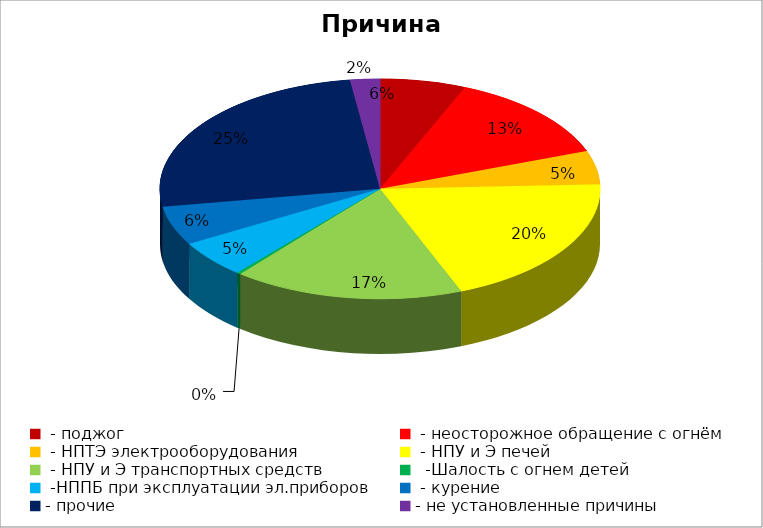
| Category | Причина пожара |
|---|---|
|  - поджог | 23 |
|  - неосторожное обращение с огнём | 48 |
|  - НПТЭ электрооборудования | 18 |
|  - НПУ и Э печей | 72 |
|  - НПУ и Э транспортных средств | 62 |
|   -Шалость с огнем детей | 1 |
|  -НППБ при эксплуатации эл.приборов | 20 |
|  - курение | 21 |
| - прочие | 93 |
| - не установленные причины | 8 |